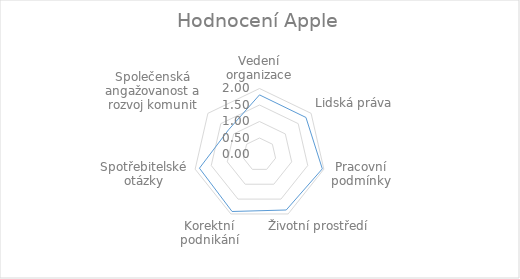
| Category | Series 0 |
|---|---|
| Vedení organizace | 1.806 |
| Lidská práva | 1.8 |
| Pracovní podmínky | 1.952 |
| Životní prostředí | 1.867 |
| Korektní podnikání | 1.917 |
| Spotřebitelské otázky | 1.867 |
| Společenská angažovanost a rozvoj komunit | 1.2 |